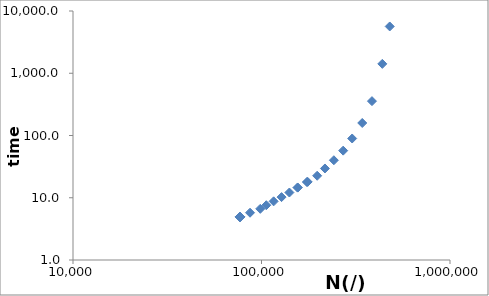
| Category | Series 0 |
|---|---|
| 478907.1384551685 | 5641.401 |
| 437488.19148589694 | 1414.649 |
| 385491.41975706135 | 356.481 |
| 342296.4431605909 | 158.868 |
| 302731.1744304813 | 89.519 |
| 271203.65610579145 | 57.108 |
| 242027.32816517854 | 40.036 |
| 217047.68944037487 | 29.523 |
| 197423.1985813866 | 22.556 |
| 174042.54505642442 | 17.895 |
| 155509.84025056244 | 14.546 |
| 175749.22105549052 | 17.983 |
| 155524.90529591235 | 14.625 |
| 140575.84829861557 | 12.13 |
| 127762.79614653834 | 10.235 |
| 115991.6139037387 | 8.752 |
| 105982.1143231064 | 7.581 |
| 98493.7804876517 | 6.637 |
| 86925.7247842238 | 5.745 |
| 76889.71339584472 | 4.918 |
| 76889.71339584472 | 4.918 |
| 76889.71339584472 | 4.918 |
| 76889.71339584472 | 4.918 |
| 76889.71339584472 | 4.918 |
| 76889.71339584472 | 4.918 |